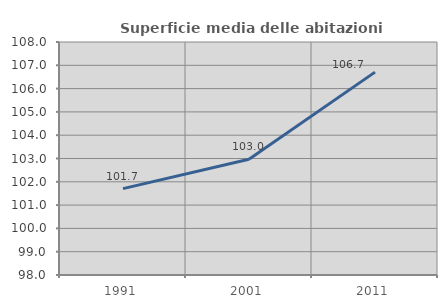
| Category | Superficie media delle abitazioni occupate |
|---|---|
| 1991.0 | 101.709 |
| 2001.0 | 102.967 |
| 2011.0 | 106.707 |